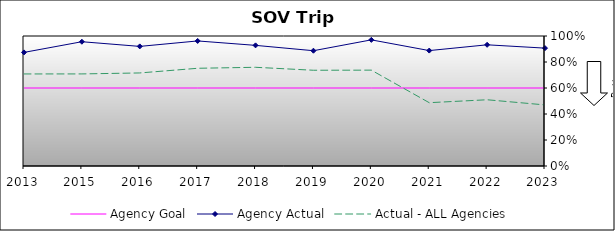
| Category | Agency Goal | Agency Actual | Actual - ALL Agencies |
|---|---|---|---|
| 2013.0 | 0.6 | 0.874 | 0.708 |
| 2015.0 | 0.6 | 0.956 | 0.708 |
| 2016.0 | 0.6 | 0.92 | 0.716 |
| 2017.0 | 0.6 | 0.962 | 0.752 |
| 2018.0 | 0.6 | 0.928 | 0.759 |
| 2019.0 | 0.6 | 0.887 | 0.736 |
| 2020.0 | 0.6 | 0.97 | 0.737 |
| 2021.0 | 0.6 | 0.888 | 0.487 |
| 2022.0 | 0.6 | 0.932 | 0.509 |
| 2023.0 | 0.6 | 0.907 | 0.47 |